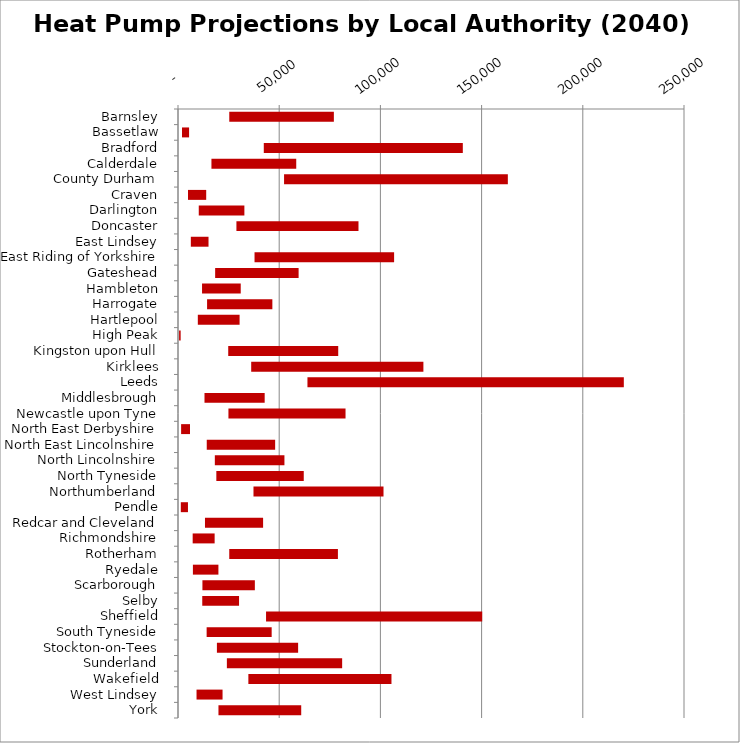
| Category | MIN | MAX |
|---|---|---|
| Barnsley | 25332 | 51677 |
| Bassetlaw | 1982 | 3497 |
| Bradford | 42384 | 98334 |
| Calderdale | 16521 | 41896 |
| County Durham | 52404 | 110563 |
| Craven | 4930 | 9004 |
| Darlington | 10257 | 22540 |
| Doncaster | 28865 | 60308 |
| East Lindsey | 6339 | 8738 |
| East Riding of Yorkshire | 37814 | 68958 |
| Gateshead | 18356 | 41234 |
| Hambleton | 11880 | 19116 |
| Harrogate | 14368 | 32251 |
| Hartlepool | 9794 | 20636 |
| High Peak | 543 | 767 |
| Kingston upon Hull | 24817 | 54345 |
| Kirklees | 36165 | 85079 |
| Leeds | 63958 | 156310 |
| Middlesbrough | 13094 | 29729 |
| Newcastle upon Tyne | 24918 | 57856 |
| North East Derbyshire | 1537 | 4387 |
| North East Lincolnshire | 14203 | 33794 |
| North Lincolnshire | 18199 | 34386 |
| North Tyneside | 18941 | 43191 |
| Northumberland | 37296 | 64240 |
| Pendle | 1384 | 3538 |
| Redcar and Cleveland | 13330 | 28715 |
| Richmondshire | 7250 | 10850 |
| Rotherham | 25325 | 53683 |
| Ryedale | 7361 | 12607 |
| Scarborough | 12067 | 25904 |
| Selby | 11987 | 18176 |
| Sheffield | 43503 | 106797 |
| South Tyneside | 14149 | 32131 |
| Stockton-on-Tees | 19223 | 40127 |
| Sunderland | 24145 | 56957 |
| Wakefield | 34766 | 70699 |
| West Lindsey | 9156 | 12855 |
| York | 19991 | 40886 |